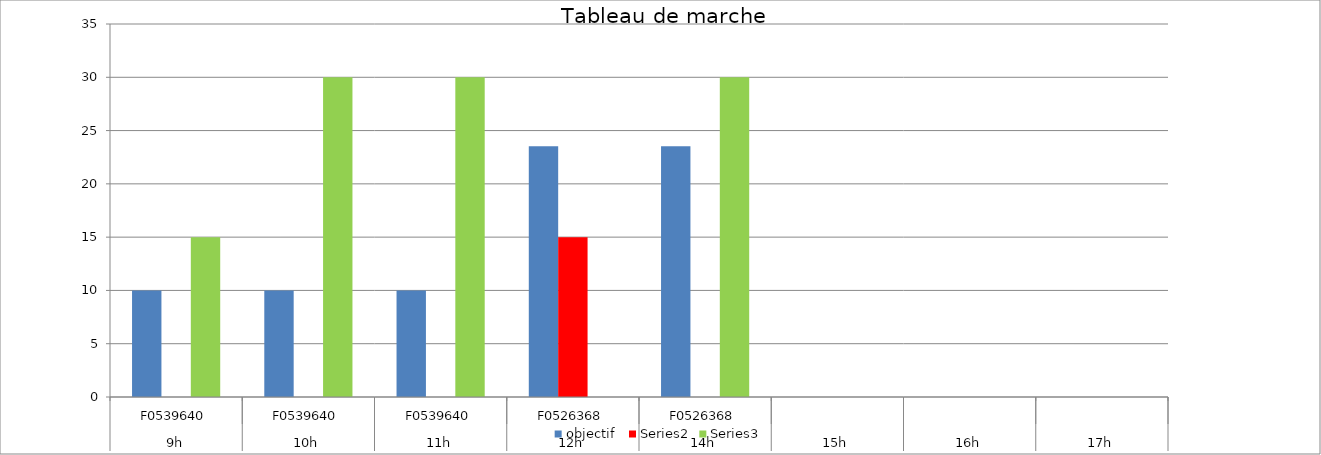
| Category | objectif  | Series 2 | Series 3 |
|---|---|---|---|
| 0 | 10 | 0 | 15 |
| 1 | 10 | 0 | 30 |
| 2 | 10 | 0 | 30 |
| 3 | 23.529 | 15 | 0 |
| 4 | 23.529 | 0 | 30 |
| 5 | 0 | 0 | 0 |
| 6 | 0 | 0 | 0 |
| 7 | 0 | 0 | 0 |